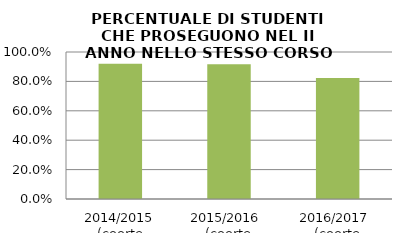
| Category | 2014/2015 (coorte 2013/14) 2015/2016  (coorte 2014/15) 2016/2017  (coorte 2015/16) |
|---|---|
| 2014/2015 (coorte 2013/14) | 0.92 |
| 2015/2016  (coorte 2014/15) | 0.917 |
| 2016/2017  (coorte 2015/16) | 0.824 |